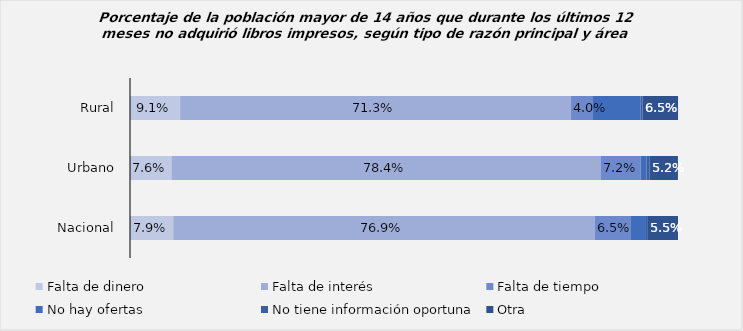
| Category | Falta de dinero | Falta de interés | Falta de tiempo | No hay ofertas | No tiene información oportuna | Otra |
|---|---|---|---|---|---|---|
| Rural | 0.091 | 0.713 | 0.04 | 0.086 | 0.004 | 0.065 |
| Urbano | 0.076 | 0.784 | 0.072 | 0.011 | 0.006 | 0.052 |
| Nacional | 0.079 | 0.769 | 0.065 | 0.027 | 0.005 | 0.055 |